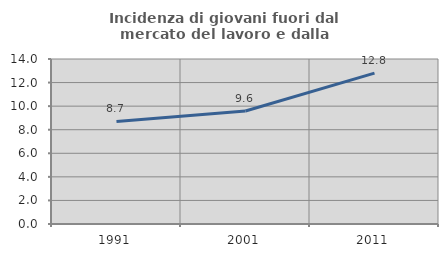
| Category | Incidenza di giovani fuori dal mercato del lavoro e dalla formazione  |
|---|---|
| 1991.0 | 8.7 |
| 2001.0 | 9.588 |
| 2011.0 | 12.804 |